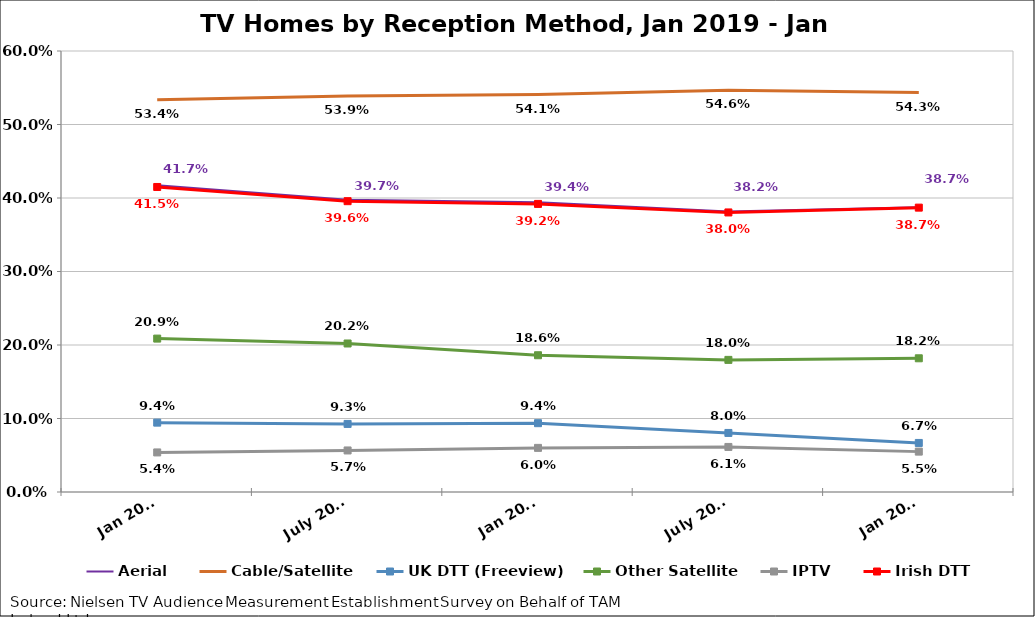
| Category | Aerial | Cable/Satellite | UK DTT (Freeview) | Other Satellite | IPTV | Irish DTT |
|---|---|---|---|---|---|---|
| Jan 2019 | 0.417 | 0.534 | 0.094 | 0.209 | 0.054 | 0.415 |
| July 2019 | 0.397 | 0.539 | 0.093 | 0.202 | 0.057 | 0.396 |
| Jan 2020 | 0.394 | 0.541 | 0.094 | 0.186 | 0.06 | 0.392 |
| July 2020 | 0.382 | 0.546 | 0.08 | 0.18 | 0.061 | 0.38 |
| Jan 2021 | 0.387 | 0.543 | 0.067 | 0.182 | 0.055 | 0.387 |